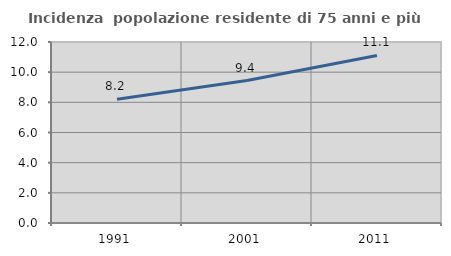
| Category | Incidenza  popolazione residente di 75 anni e più |
|---|---|
| 1991.0 | 8.205 |
| 2001.0 | 9.441 |
| 2011.0 | 11.111 |